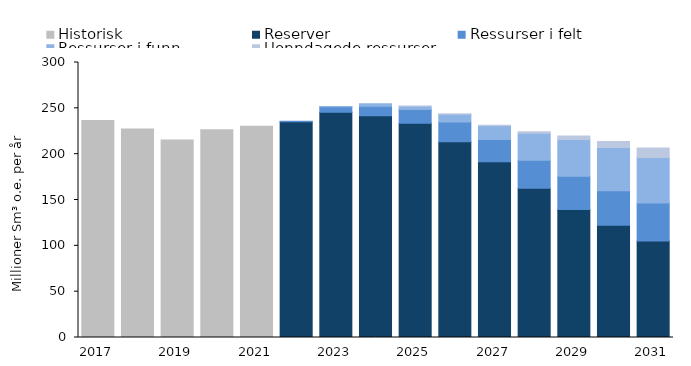
| Category | Historisk | Reserver | Ressurser i felt | Ressurser i funn | Uoppdagede ressurser |
|---|---|---|---|---|---|
| 2017.0 | 236.75 | 0 | 0 | 0 | 0 |
| 2018.0 | 227.33 | 0 | 0 | 0 | 0 |
| 2019.0 | 215.32 | 0 | 0 | 0 | 0 |
| 2020.0 | 226.64 | 0 | 0 | 0 | 0 |
| 2021.0 | 230.56 | 0 | 0 | 0 | 0 |
| 2022.0 | 0 | 235.24 | 0.73 | 0 | 0 |
| 2023.0 | 0 | 245.73 | 6.13 | 0.03 | 0 |
| 2024.0 | 0 | 242 | 10.28 | 2.62 | 0 |
| 2025.0 | 0 | 233.84 | 14.91 | 3.49 | 0.04 |
| 2026.0 | 0 | 213.42 | 21.63 | 8.54 | 0.19 |
| 2027.0 | 0 | 191.67 | 24.43 | 14.79 | 0.77 |
| 2028.0 | 0 | 162.95 | 30.38 | 29.41 | 1.59 |
| 2029.0 | 0 | 139.61 | 36.42 | 39.86 | 3.9 |
| 2030.0 | 0 | 122.32 | 37.87 | 46.96 | 6.62 |
| 2031.0 | 0 | 105.15 | 41.51 | 49.68 | 10.27 |